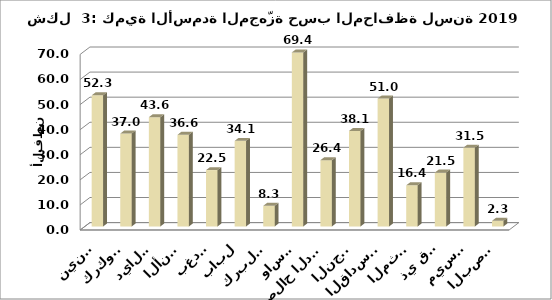
| Category | Series 0 |
|---|---|
| نينوى | 52.285 |
| كركوك | 37.049 |
| ديالى | 43.575 |
| الأنبار | 36.556 |
| بغداد | 22.476 |
| بابل | 34.127 |
| كربلاء | 8.256 |
| واسط | 69.39 |
| صلاح الدين | 26.436 |
| النجف | 38.079 |
| القادسية | 50.999 |
| المثنى | 16.415 |
| ذي قار | 21.49 |
| ميسان | 31.45 |
| البصرة | 2.253 |